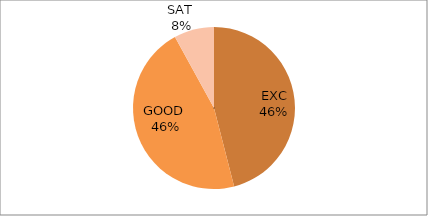
| Category | Series 1 | Series 0 |
|---|---|---|
| EXC | 46 | 46 |
| GOOD  | 46 | 46 |
| SAT  | 8 | 8 |